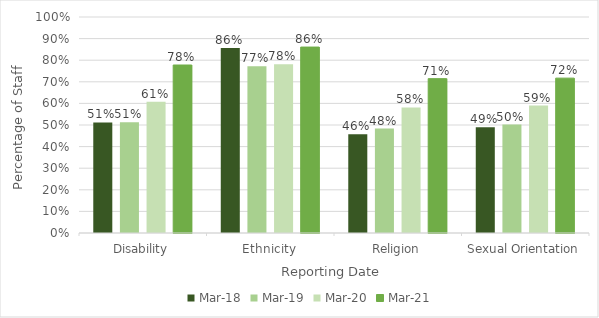
| Category | Mar-18 | Mar-19 | Mar-20 | Mar-21 |
|---|---|---|---|---|
| Disability | 0.512 | 0.513 | 0.607 | 0.778 |
| Ethnicity | 0.857 | 0.772 | 0.781 | 0.861 |
| Religion | 0.457 | 0.483 | 0.581 | 0.715 |
| Sexual Orientation | 0.49 | 0.502 | 0.59 | 0.717 |